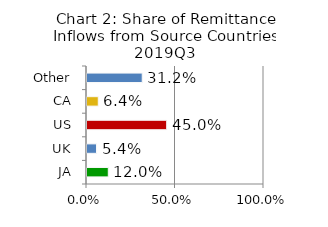
| Category | Chart 2: Share of Remittance Inflows from Source Countries 2019Q3 |
|---|---|
| JA | 0.12 |
| UK | 0.054 |
| US | 0.45 |
| CA | 0.064 |
| Other | 0.312 |